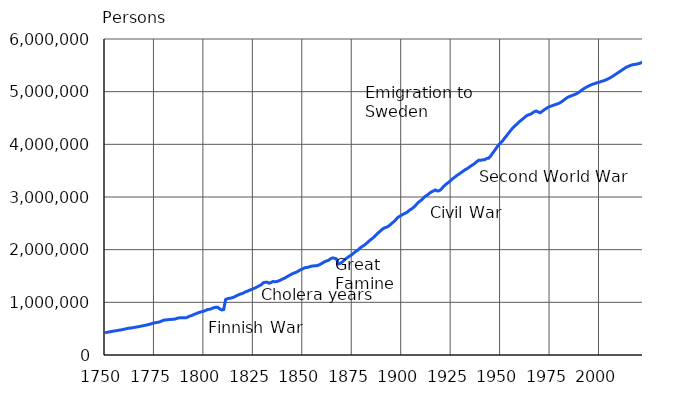
| Category | Thousand persons |
|---|---|
| 1750.0 | 421500 |
| 1751.0 | 429900 |
| 1752.0 | 437600 |
| 1753.0 | 445300 |
| 1754.0 | 450100 |
| 1755.0 | 457800 |
| 1756.0 | 462600 |
| 1757.0 | 470900 |
| 1758.0 | 476000 |
| 1759.0 | 482900 |
| 1760.0 | 491100 |
| 1761.0 | 501400 |
| 1762.0 | 509000 |
| 1763.0 | 511700 |
| 1764.0 | 518300 |
| 1765.0 | 525200 |
| 1766.0 | 532100 |
| 1767.0 | 537800 |
| 1768.0 | 546500 |
| 1769.0 | 553700 |
| 1770.0 | 561000 |
| 1771.0 | 569000 |
| 1772.0 | 578100 |
| 1773.0 | 588400 |
| 1774.0 | 600400 |
| 1775.0 | 610100 |
| 1776.0 | 616400 |
| 1777.0 | 622600 |
| 1778.0 | 634800 |
| 1779.0 | 649600 |
| 1780.0 | 663900 |
| 1781.0 | 665900 |
| 1782.0 | 671600 |
| 1783.0 | 672100 |
| 1784.0 | 678400 |
| 1785.0 | 679400 |
| 1786.0 | 690000 |
| 1787.0 | 703000 |
| 1788.0 | 706300 |
| 1789.0 | 705100 |
| 1790.0 | 705600 |
| 1791.0 | 706600 |
| 1792.0 | 723300 |
| 1793.0 | 741000 |
| 1794.0 | 752400 |
| 1795.0 | 770800 |
| 1796.0 | 783500 |
| 1797.0 | 800100 |
| 1798.0 | 813500 |
| 1799.0 | 822600 |
| 1800.0 | 832700 |
| 1801.0 | 848900 |
| 1802.0 | 864700 |
| 1803.0 | 868200 |
| 1804.0 | 881800 |
| 1805.0 | 898400 |
| 1806.0 | 905600 |
| 1807.0 | 906800 |
| 1808.0 | 874800 |
| 1809.0 | 854800 |
| 1810.0 | 863300 |
| 1811.0 | 1053400 |
| 1812.0 | 1069300 |
| 1813.0 | 1078300 |
| 1814.0 | 1083200 |
| 1815.0 | 1096000 |
| 1816.0 | 1114700 |
| 1817.0 | 1133300 |
| 1818.0 | 1150700 |
| 1819.0 | 1162600 |
| 1820.0 | 1177500 |
| 1821.0 | 1199900 |
| 1822.0 | 1209700 |
| 1823.0 | 1229800 |
| 1824.0 | 1243200 |
| 1825.0 | 1259200 |
| 1826.0 | 1274700 |
| 1827.0 | 1294100 |
| 1828.0 | 1315800 |
| 1829.0 | 1332000 |
| 1830.0 | 1372100 |
| 1831.0 | 1381900 |
| 1832.0 | 1383500 |
| 1833.0 | 1361800 |
| 1834.0 | 1379800 |
| 1835.0 | 1393700 |
| 1836.0 | 1392400 |
| 1837.0 | 1396600 |
| 1838.0 | 1409400 |
| 1839.0 | 1427800 |
| 1840.0 | 1445600 |
| 1841.0 | 1463100 |
| 1842.0 | 1486100 |
| 1843.0 | 1507000 |
| 1844.0 | 1527500 |
| 1845.0 | 1547700 |
| 1846.0 | 1561100 |
| 1847.0 | 1578400 |
| 1848.0 | 1599300 |
| 1849.0 | 1620900 |
| 1850.0 | 1636900 |
| 1851.0 | 1657600 |
| 1852.0 | 1662800 |
| 1853.0 | 1669200 |
| 1854.0 | 1685500 |
| 1855.0 | 1688700 |
| 1856.0 | 1693300 |
| 1857.0 | 1694400 |
| 1858.0 | 1706800 |
| 1859.0 | 1726000 |
| 1860.0 | 1746700 |
| 1861.0 | 1770600 |
| 1862.0 | 1786200 |
| 1863.0 | 1797400 |
| 1864.0 | 1827000 |
| 1865.0 | 1843200 |
| 1866.0 | 1837500 |
| 1867.0 | 1824200 |
| 1868.0 | 1727500 |
| 1869.0 | 1739600 |
| 1870.0 | 1768800 |
| 1871.0 | 1803800 |
| 1872.0 | 1834600 |
| 1873.0 | 1860000 |
| 1874.0 | 1886100 |
| 1875.0 | 1912600 |
| 1876.0 | 1942700 |
| 1877.0 | 1971400 |
| 1878.0 | 1994600 |
| 1879.0 | 2032700 |
| 1880.0 | 2060800 |
| 1881.0 | 2082600 |
| 1882.0 | 2113300 |
| 1883.0 | 2146400 |
| 1884.0 | 2180500 |
| 1885.0 | 2208500 |
| 1886.0 | 2238600 |
| 1887.0 | 2278100 |
| 1888.0 | 2314200 |
| 1889.0 | 2347700 |
| 1890.0 | 2380100 |
| 1891.0 | 2408300 |
| 1892.0 | 2422500 |
| 1893.0 | 2436700 |
| 1894.0 | 2465700 |
| 1895.0 | 2499900 |
| 1896.0 | 2530900 |
| 1897.0 | 2567500 |
| 1898.0 | 2610300 |
| 1899.0 | 2635300 |
| 1900.0 | 2655900 |
| 1901.0 | 2678500 |
| 1902.0 | 2693900 |
| 1903.0 | 2717100 |
| 1904.0 | 2751900 |
| 1905.0 | 2773000 |
| 1906.0 | 2803700 |
| 1907.0 | 2838700 |
| 1908.0 | 2883000 |
| 1909.0 | 2914800 |
| 1910.0 | 2943400 |
| 1911.0 | 2980000 |
| 1912.0 | 3015500 |
| 1913.0 | 3035800 |
| 1914.0 | 3069500 |
| 1915.0 | 3096300 |
| 1916.0 | 3114200 |
| 1917.0 | 3134300 |
| 1918.0 | 3115300 |
| 1919.0 | 3118000 |
| 1920.0 | 3147600 |
| 1921.0 | 3193200 |
| 1922.0 | 3227800 |
| 1923.0 | 3258600 |
| 1924.0 | 3286200 |
| 1925.0 | 3322100 |
| 1926.0 | 3355200 |
| 1927.0 | 3380600 |
| 1928.0 | 3412100 |
| 1929.0 | 3435300 |
| 1930.0 | 3462700 |
| 1931.0 | 3489600 |
| 1932.0 | 3516000 |
| 1933.0 | 3536600 |
| 1934.0 | 3561600 |
| 1935.0 | 3589600 |
| 1936.0 | 3612400 |
| 1937.0 | 3640200 |
| 1938.0 | 3672100 |
| 1939.0 | 3699700 |
| 1940.0 | 3695617 |
| 1941.0 | 3707815 |
| 1942.0 | 3708801 |
| 1943.0 | 3732532 |
| 1944.0 | 3737096 |
| 1945.0 | 3778890 |
| 1946.0 | 3833072 |
| 1947.0 | 3885284 |
| 1948.0 | 3937840 |
| 1949.0 | 3987996 |
| 1950.0 | 4029803 |
| 1951.0 | 4064727 |
| 1952.0 | 4116228 |
| 1953.0 | 4162609 |
| 1954.0 | 4211191 |
| 1955.0 | 4258571 |
| 1956.0 | 4304832 |
| 1957.0 | 4343190 |
| 1958.0 | 4376314 |
| 1959.0 | 4413046 |
| 1960.0 | 4446222 |
| 1961.0 | 4475787 |
| 1962.0 | 4507098 |
| 1963.0 | 4539519 |
| 1964.0 | 4557567 |
| 1965.0 | 4569896 |
| 1966.0 | 4591842 |
| 1967.0 | 4619645 |
| 1968.0 | 4633292 |
| 1969.0 | 4614277 |
| 1970.0 | 4598336 |
| 1971.0 | 4625912 |
| 1972.0 | 4653401 |
| 1973.0 | 4678761 |
| 1974.0 | 4702387 |
| 1975.0 | 4720492 |
| 1976.0 | 4730836 |
| 1977.0 | 4746967 |
| 1978.0 | 4758088 |
| 1979.0 | 4771292 |
| 1980.0 | 4787778 |
| 1981.0 | 4812150 |
| 1982.0 | 4841715 |
| 1983.0 | 4869858 |
| 1984.0 | 4893748 |
| 1985.0 | 4910664 |
| 1986.0 | 4925644 |
| 1987.0 | 4938602 |
| 1988.0 | 4954359 |
| 1989.0 | 4974383 |
| 1990.0 | 4998478 |
| 1991.0 | 5029002 |
| 1992.0 | 5054982 |
| 1993.0 | 5077912 |
| 1994.0 | 5098754 |
| 1995.0 | 5116826 |
| 1996.0 | 5132320 |
| 1997.0 | 5147349 |
| 1998.0 | 5159646 |
| 1999.0 | 5171302 |
| 2000.0 | 5181115 |
| 2001.0 | 5194901 |
| 2002.0 | 5206295 |
| 2003.0 | 5219732 |
| 2004.0 | 5236611 |
| 2005.0 | 5255580 |
| 2006.0 | 5276955 |
| 2007.0 | 5300484 |
| 2008.0 | 5326314 |
| 2009.0 | 5351427 |
| 2010.0 | 5375276 |
| 2011.0 | 5401267 |
| 2012.0 | 5426674 |
| 2013.0 | 5451270 |
| 2014.0 | 5471753 |
| 2015.0 | 5487308 |
| 2016.0 | 5503297 |
| 2017.0 | 5513130 |
| 2018.0 | 5517919 |
| 2019.0 | 5525292 |
| 2020.0 | 5533793 |
| 2021.0 | 5548241 |
| 2022.0 | 5563970 |